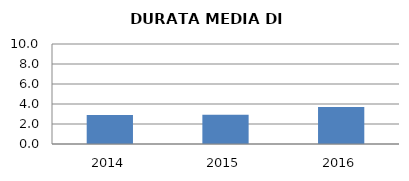
| Category | 2014 2015 2016 |
|---|---|
| 2014.0 | 2.905 |
| 2015.0 | 2.913 |
| 2016.0 | 3.692 |